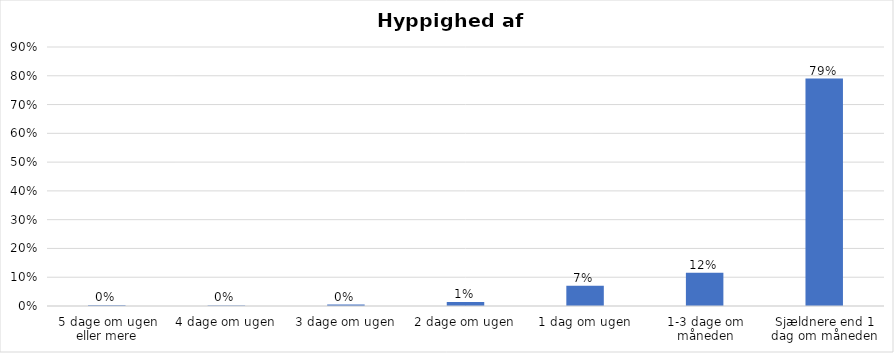
| Category | % |
|---|---|
| 5 dage om ugen eller mere | 0.003 |
| 4 dage om ugen | 0.002 |
| 3 dage om ugen | 0.005 |
| 2 dage om ugen | 0.014 |
| 1 dag om ugen | 0.07 |
| 1-3 dage om måneden | 0.116 |
| Sjældnere end 1 dag om måneden | 0.79 |